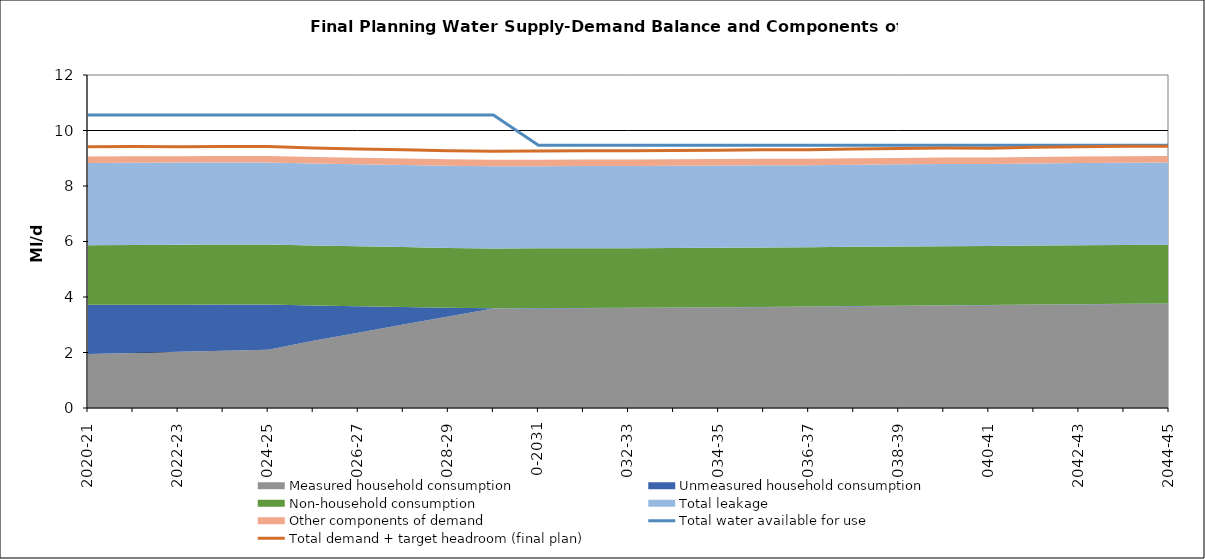
| Category | Total water available for use | Total demand + target headroom (final plan) |
|---|---|---|
| 0 | 10.56 | 9.411 |
| 1 | 10.56 | 9.419 |
| 2 | 10.56 | 9.416 |
| 3 | 10.56 | 9.424 |
| 4 | 10.56 | 9.425 |
| 5 | 10.56 | 9.367 |
| 6 | 10.56 | 9.329 |
| 7 | 10.56 | 9.303 |
| 8 | 10.56 | 9.273 |
| 9 | 10.56 | 9.255 |
| 10 | 9.47 | 9.257 |
| 11 | 9.47 | 9.273 |
| 12 | 9.47 | 9.273 |
| 13 | 9.47 | 9.284 |
| 14 | 9.47 | 9.289 |
| 15 | 9.47 | 9.309 |
| 16 | 9.47 | 9.304 |
| 17 | 9.47 | 9.332 |
| 18 | 9.47 | 9.353 |
| 19 | 9.47 | 9.365 |
| 20 | 9.47 | 9.361 |
| 21 | 9.47 | 9.399 |
| 22 | 9.47 | 9.41 |
| 23 | 9.47 | 9.432 |
| 24 | 9.47 | 9.428 |